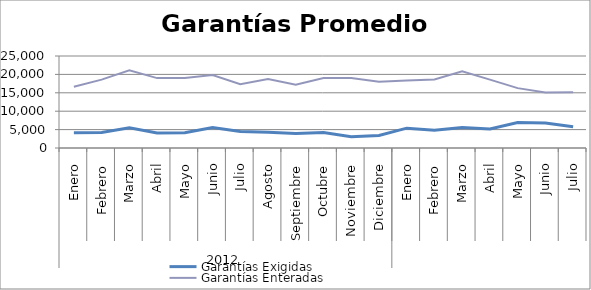
| Category | Garantías Exigidas | Garantías Enteradas |
|---|---|---|
| 0 | 4146.8 | 16662.483 |
| 1 | 4190.531 | 18572.749 |
| 2 | 5482.211 | 21128.648 |
| 3 | 4079.038 | 18997.51 |
| 4 | 4141.554 | 19005.364 |
| 5 | 5549.139 | 19818.91 |
| 6 | 4487.023 | 17351.39 |
| 7 | 4277.924 | 18719.955 |
| 8 | 3940.893 | 17217.403 |
| 9 | 4180.69 | 19046.939 |
| 10 | 3056.997 | 19028.425 |
| 11 | 3426.799 | 17994.819 |
| 12 | 5390.461 | 18317.043 |
| 13 | 4807.91 | 18608.477 |
| 14 | 5582.739 | 20850.446 |
| 15 | 5196.755 | 18583.166 |
| 16 | 6912.615 | 16266.455 |
| 17 | 6790.981 | 15108.06 |
| 18 | 5787.122 | 15161.964 |